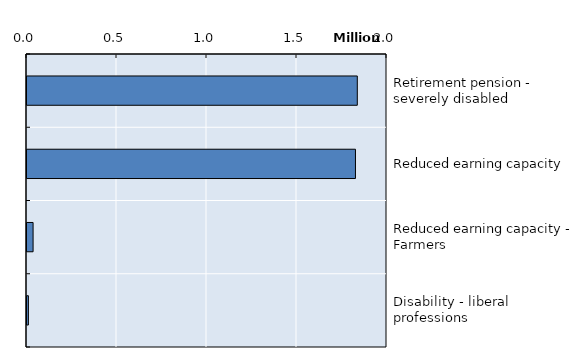
| Category | Series 0 |
|---|---|
| Retirement pension - severely disabled | 1835003 |
| Reduced earning capacity | 1824819 |
| Reduced earning capacity - Farmers | 33802 |
| Disability - liberal professions | 7780 |